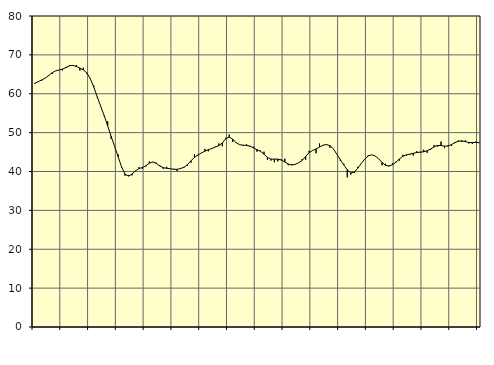
| Category | Piggar | Series 1 |
|---|---|---|
| nan | 62.5 | 62.7 |
| 87.0 | 63.2 | 63.11 |
| 87.0 | 63.3 | 63.54 |
| 87.0 | 64 | 64.03 |
| nan | 64.8 | 64.68 |
| 88.0 | 65.1 | 65.38 |
| 88.0 | 65.9 | 65.88 |
| 88.0 | 66.1 | 66.11 |
| nan | 66 | 66.35 |
| 89.0 | 66.9 | 66.74 |
| 89.0 | 67.4 | 67.2 |
| 89.0 | 67.4 | 67.29 |
| nan | 67.4 | 67 |
| 90.0 | 66 | 66.6 |
| 90.0 | 66.7 | 66.13 |
| 90.0 | 65.2 | 65.37 |
| nan | 63.8 | 63.88 |
| 91.0 | 62.1 | 61.71 |
| 91.0 | 59 | 59.21 |
| 91.0 | 56.8 | 56.75 |
| nan | 54.2 | 54.37 |
| 92.0 | 52.9 | 51.74 |
| 92.0 | 48.4 | 49.04 |
| 92.0 | 46.5 | 46.48 |
| nan | 44.4 | 43.83 |
| 93.0 | 41 | 41.22 |
| 93.0 | 38.9 | 39.34 |
| 93.0 | 39.1 | 38.81 |
| nan | 39 | 39.35 |
| 94.0 | 40.1 | 40.16 |
| 94.0 | 41.1 | 40.73 |
| 94.0 | 40.7 | 41.04 |
| nan | 41.3 | 41.48 |
| 95.0 | 42.6 | 42.14 |
| 95.0 | 42.4 | 42.46 |
| 95.0 | 42.3 | 42.08 |
| nan | 41.6 | 41.42 |
| 96.0 | 40.7 | 40.98 |
| 96.0 | 41.2 | 40.83 |
| 96.0 | 40.7 | 40.71 |
| nan | 40.7 | 40.57 |
| 97.0 | 40.1 | 40.56 |
| 97.0 | 40.9 | 40.76 |
| 97.0 | 41 | 41.12 |
| nan | 41.5 | 41.79 |
| 98.0 | 42.3 | 42.76 |
| 98.0 | 44.4 | 43.66 |
| 98.0 | 44.1 | 44.25 |
| nan | 44.8 | 44.76 |
| 99.0 | 45.8 | 45.23 |
| 99.0 | 45.2 | 45.61 |
| 99.0 | 45.8 | 45.94 |
| nan | 46.4 | 46.3 |
| 0.0 | 47.2 | 46.65 |
| 0.0 | 46.5 | 47.35 |
| 0.0 | 48.7 | 48.41 |
| nan | 49.5 | 48.86 |
| 1.0 | 47.6 | 48.33 |
| 1.0 | 47.5 | 47.39 |
| 1.0 | 46.9 | 46.9 |
| nan | 46.6 | 46.77 |
| 2.0 | 47 | 46.7 |
| 2.0 | 46.3 | 46.53 |
| 2.0 | 46.4 | 46.06 |
| nan | 45.1 | 45.61 |
| 3.0 | 45.4 | 45.19 |
| 3.0 | 45.1 | 44.46 |
| 3.0 | 43 | 43.64 |
| nan | 42.8 | 43.19 |
| 4.0 | 42.4 | 43.18 |
| 4.0 | 42.6 | 43.19 |
| 4.0 | 43.2 | 42.94 |
| nan | 43.3 | 42.46 |
| 5.0 | 41.6 | 41.93 |
| 5.0 | 41.9 | 41.66 |
| 5.0 | 41.8 | 41.84 |
| nan | 42.2 | 42.25 |
| 6.0 | 43.2 | 42.86 |
| 6.0 | 43 | 43.87 |
| 6.0 | 45.3 | 44.83 |
| nan | 45.5 | 45.4 |
| 7.0 | 44.7 | 45.79 |
| 7.0 | 47.2 | 46.28 |
| 7.0 | 46.7 | 46.77 |
| nan | 47 | 46.92 |
| 8.0 | 46.1 | 46.66 |
| 8.0 | 45.8 | 45.82 |
| 8.0 | 44.4 | 44.41 |
| nan | 42.7 | 43.01 |
| 9.0 | 42 | 41.67 |
| 9.0 | 38.5 | 40.42 |
| 9.0 | 39.2 | 39.65 |
| nan | 39.6 | 39.85 |
| 10.0 | 41.2 | 40.83 |
| 10.0 | 42 | 42.04 |
| 10.0 | 43.2 | 43.17 |
| nan | 44.1 | 43.99 |
| 11.0 | 44.3 | 44.3 |
| 11.0 | 44 | 44.01 |
| 11.0 | 43.3 | 43.3 |
| nan | 41.6 | 42.35 |
| 12.0 | 42 | 41.6 |
| 12.0 | 41.3 | 41.43 |
| 12.0 | 42.1 | 41.73 |
| nan | 42.5 | 42.38 |
| 13.0 | 42.8 | 43.22 |
| 13.0 | 44.3 | 43.91 |
| 13.0 | 44.1 | 44.28 |
| nan | 44.3 | 44.47 |
| 14.0 | 44.1 | 44.67 |
| 14.0 | 45.2 | 44.88 |
| 14.0 | 44.8 | 45 |
| nan | 45.6 | 45.07 |
| 15.0 | 44.8 | 45.34 |
| 15.0 | 45.6 | 45.77 |
| 15.0 | 46.8 | 46.33 |
| nan | 46.4 | 46.71 |
| 16.0 | 47.7 | 46.67 |
| 16.0 | 46 | 46.53 |
| 16.0 | 46.7 | 46.55 |
| nan | 46.6 | 46.92 |
| 17.0 | 47.6 | 47.42 |
| 17.0 | 48 | 47.78 |
| 17.0 | 47.6 | 47.89 |
| nan | 48 | 47.68 |
| 18.0 | 47.2 | 47.47 |
| 18.0 | 47.1 | 47.45 |
| 18.0 | 47.7 | 47.5 |
| nan | 47.3 | 47.4 |